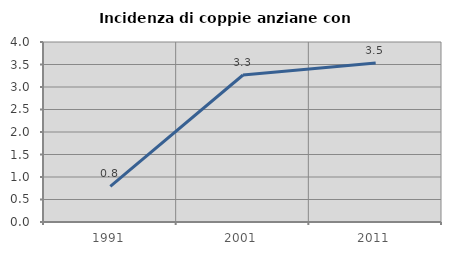
| Category | Incidenza di coppie anziane con figli |
|---|---|
| 1991.0 | 0.792 |
| 2001.0 | 3.266 |
| 2011.0 | 3.533 |